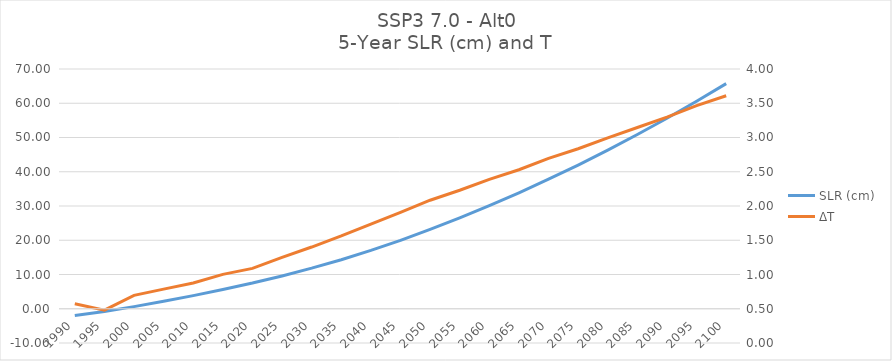
| Category | SLR (cm) |
|---|---|
| 1990.0 | -1.941 |
| 1995.0 | -0.818 |
| 2000.0 | 0.621 |
| 2005.0 | 2.18 |
| 2010.0 | 3.834 |
| 2015.0 | 5.633 |
| 2020.0 | 7.505 |
| 2025.0 | 9.582 |
| 2030.0 | 11.846 |
| 2035.0 | 14.321 |
| 2040.0 | 17.03 |
| 2045.0 | 19.967 |
| 2050.0 | 23.152 |
| 2055.0 | 26.519 |
| 2060.0 | 30.098 |
| 2065.0 | 33.847 |
| 2070.0 | 37.818 |
| 2075.0 | 41.963 |
| 2080.0 | 46.317 |
| 2085.0 | 50.865 |
| 2090.0 | 55.604 |
| 2095.0 | 60.573 |
| 2100.0 | 65.724 |